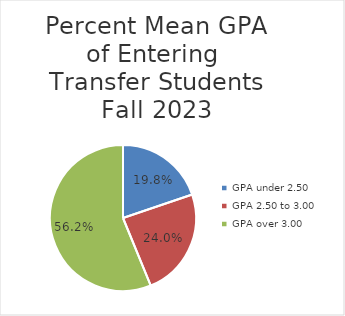
| Category | Series 0 |
|---|---|
| GPA under 2.50 | 0.198 |
| GPA 2.50 to 3.00 | 0.24 |
| GPA over 3.00 | 0.562 |